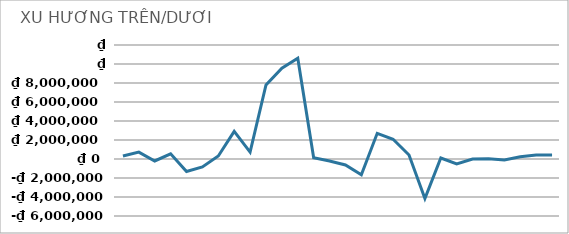
| Category | SAI BIỆT |
|---|---|
| 0 | 312000 |
| 1 | 728000 |
| 2 | -208000 |
| 3 | 540800 |
| 4 | -1310400 |
| 5 | -832000 |
| 6 | 312000 |
| 7 | 2912000 |
| 8 | 728000 |
| 9 | 7800000 |
| 10 | 9568000 |
| 11 | 10608000 |
| 12 | 124800 |
| 13 | -208000 |
| 14 | -624000 |
| 15 | -1664000 |
| 16 | 2704000 |
| 17 | 2080000 |
| 18 | 416000 |
| 19 | -4160000 |
| 20 | 104000 |
| 21 | -520000 |
| 22 | 0 |
| 23 | 20800 |
| 24 | -104000 |
| 25 | 228800 |
| 26 | 416000 |
| 27 | 416000 |